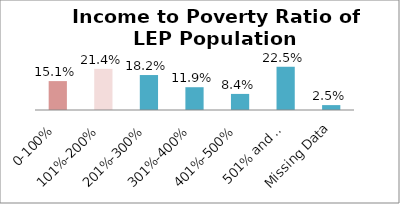
| Category | Percent |
|---|---|
| 0-100% | 0.151 |
| 101%-200% | 0.214 |
| 201%-300% | 0.182 |
| 301%-400% | 0.119 |
| 401%-500% | 0.084 |
| 501% and Over | 0.225 |
| Missing Data | 0.025 |